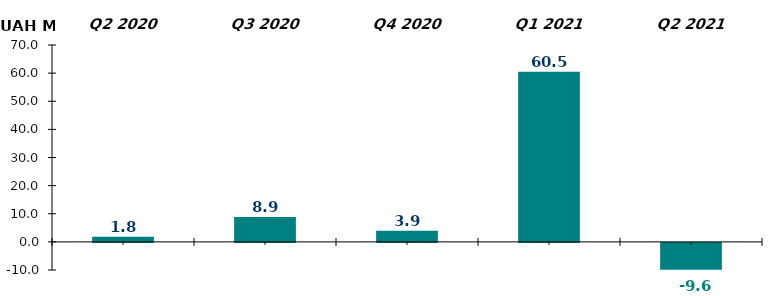
| Category | Net inflow / outflow for the corresponding quarter, UAH M |
|---|---|
| Q2 2020 | 1.78 |
| Q3 2020 | 8.85 |
| Q4 2020 | 3.93 |
| Q1 2021 | 60.53 |
| Q2 2021 | -9.56 |